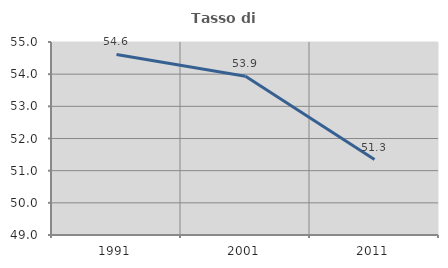
| Category | Tasso di occupazione   |
|---|---|
| 1991.0 | 54.613 |
| 2001.0 | 53.937 |
| 2011.0 | 51.344 |